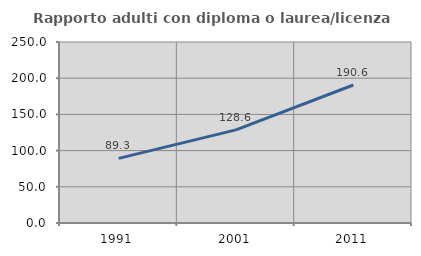
| Category | Rapporto adulti con diploma o laurea/licenza media  |
|---|---|
| 1991.0 | 89.266 |
| 2001.0 | 128.571 |
| 2011.0 | 190.63 |